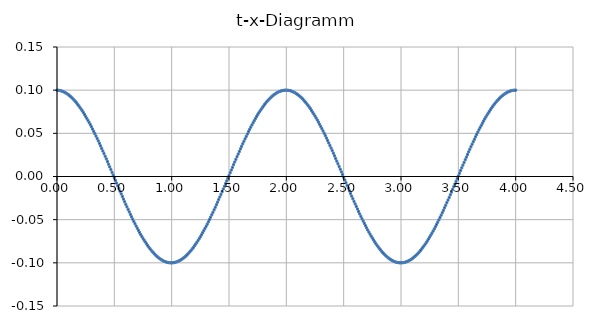
| Category | Series 0 |
|---|---|
| 0.0 | 0.1 |
| 0.01 | 0.1 |
| 0.02 | 0.1 |
| 0.03 | 0.099 |
| 0.04 | 0.099 |
| 0.05 | 0.099 |
| 0.06 | 0.098 |
| 0.07 | 0.097 |
| 0.08 | 0.096 |
| 0.09 | 0.096 |
| 0.1 | 0.095 |
| 0.11 | 0.094 |
| 0.12 | 0.092 |
| 0.13 | 0.091 |
| 0.14 | 0.09 |
| 0.15 | 0.088 |
| 0.16 | 0.087 |
| 0.17 | 0.085 |
| 0.18 | 0.084 |
| 0.19 | 0.082 |
| 0.2 | 0.08 |
| 0.21 | 0.078 |
| 0.22 | 0.076 |
| 0.23 | 0.074 |
| 0.24 | 0.072 |
| 0.25 | 0.07 |
| 0.26 | 0.067 |
| 0.27 | 0.065 |
| 0.28 | 0.063 |
| 0.29 | 0.06 |
| 0.3 | 0.058 |
| 0.31 | 0.055 |
| 0.32 | 0.052 |
| 0.33 | 0.05 |
| 0.34 | 0.047 |
| 0.35 | 0.044 |
| 0.36 | 0.041 |
| 0.37 | 0.038 |
| 0.38 | 0.035 |
| 0.39 | 0.032 |
| 0.4 | 0.03 |
| 0.41 | 0.026 |
| 0.42 | 0.023 |
| 0.43 | 0.02 |
| 0.44 | 0.017 |
| 0.45 | 0.014 |
| 0.46 | 0.011 |
| 0.47 | 0.008 |
| 0.48 | 0.005 |
| 0.49 | 0.002 |
| 0.5 | -0.001 |
| 0.51 | -0.005 |
| 0.52 | -0.008 |
| 0.53 | -0.011 |
| 0.54 | -0.014 |
| 0.55 | -0.017 |
| 0.56 | -0.02 |
| 0.57 | -0.023 |
| 0.58 | -0.026 |
| 0.59 | -0.029 |
| 0.6 | -0.032 |
| 0.61 | -0.035 |
| 0.62 | -0.038 |
| 0.63 | -0.041 |
| 0.64 | -0.044 |
| 0.65 | -0.047 |
| 0.66 | -0.049 |
| 0.67 | -0.052 |
| 0.68 | -0.055 |
| 0.69 | -0.057 |
| 0.7 | -0.06 |
| 0.71 | -0.062 |
| 0.72 | -0.065 |
| 0.73 | -0.067 |
| 0.74 | -0.069 |
| 0.75 | -0.072 |
| 0.76 | -0.074 |
| 0.77 | -0.076 |
| 0.78 | -0.078 |
| 0.790000000000001 | -0.08 |
| 0.8 | -0.082 |
| 0.810000000000001 | -0.083 |
| 0.82 | -0.085 |
| 0.83 | -0.087 |
| 0.84 | -0.088 |
| 0.850000000000001 | -0.09 |
| 0.860000000000001 | -0.091 |
| 0.87 | -0.092 |
| 0.88 | -0.093 |
| 0.890000000000001 | -0.095 |
| 0.900000000000001 | -0.096 |
| 0.910000000000001 | -0.096 |
| 0.92 | -0.097 |
| 0.930000000000001 | -0.098 |
| 0.940000000000001 | -0.098 |
| 0.950000000000001 | -0.099 |
| 0.960000000000001 | -0.099 |
| 0.970000000000001 | -0.1 |
| 0.980000000000001 | -0.1 |
| 0.990000000000001 | -0.1 |
| 1.0 | -0.1 |
| 1.01 | -0.1 |
| 1.02 | -0.1 |
| 1.03 | -0.099 |
| 1.04 | -0.099 |
| 1.05 | -0.099 |
| 1.06 | -0.098 |
| 1.07 | -0.097 |
| 1.08 | -0.097 |
| 1.09 | -0.096 |
| 1.1 | -0.095 |
| 1.11 | -0.094 |
| 1.12 | -0.093 |
| 1.13 | -0.091 |
| 1.14 | -0.09 |
| 1.15 | -0.089 |
| 1.16 | -0.087 |
| 1.17 | -0.085 |
| 1.18 | -0.084 |
| 1.19 | -0.082 |
| 1.2 | -0.08 |
| 1.21 | -0.078 |
| 1.22 | -0.076 |
| 1.23 | -0.074 |
| 1.24 | -0.072 |
| 1.25 | -0.07 |
| 1.26 | -0.068 |
| 1.27 | -0.065 |
| 1.28 | -0.063 |
| 1.29 | -0.06 |
| 1.3 | -0.058 |
| 1.31 | -0.055 |
| 1.32 | -0.053 |
| 1.33 | -0.05 |
| 1.34 | -0.047 |
| 1.35 | -0.044 |
| 1.36 | -0.041 |
| 1.37 | -0.039 |
| 1.38 | -0.036 |
| 1.39 | -0.033 |
| 1.4 | -0.03 |
| 1.41 | -0.027 |
| 1.42 | -0.024 |
| 1.43 | -0.021 |
| 1.44 | -0.018 |
| 1.45 | -0.014 |
| 1.46 | -0.011 |
| 1.47 | -0.008 |
| 1.48 | -0.005 |
| 1.49 | -0.002 |
| 1.5 | 0.001 |
| 1.51 | 0.004 |
| 1.52 | 0.007 |
| 1.53 | 0.011 |
| 1.54 | 0.014 |
| 1.55 | 0.017 |
| 1.56 | 0.02 |
| 1.57 | 0.023 |
| 1.58 | 0.026 |
| 1.59 | 0.029 |
| 1.6 | 0.032 |
| 1.61 | 0.035 |
| 1.62 | 0.038 |
| 1.63 | 0.041 |
| 1.64 | 0.044 |
| 1.65 | 0.046 |
| 1.66 | 0.049 |
| 1.67 | 0.052 |
| 1.68 | 0.055 |
| 1.69 | 0.057 |
| 1.7 | 0.06 |
| 1.71 | 0.062 |
| 1.72 | 0.065 |
| 1.73 | 0.067 |
| 1.74 | 0.069 |
| 1.75 | 0.071 |
| 1.76 | 0.074 |
| 1.77 | 0.076 |
| 1.78 | 0.078 |
| 1.79 | 0.08 |
| 1.8 | 0.082 |
| 1.81 | 0.083 |
| 1.82 | 0.085 |
| 1.83 | 0.087 |
| 1.84 | 0.088 |
| 1.85 | 0.09 |
| 1.86 | 0.091 |
| 1.87 | 0.092 |
| 1.88 | 0.093 |
| 1.89 | 0.094 |
| 1.9 | 0.095 |
| 1.91 | 0.096 |
| 1.92 | 0.097 |
| 1.93 | 0.098 |
| 1.94 | 0.098 |
| 1.95 | 0.099 |
| 1.96 | 0.099 |
| 1.97 | 0.1 |
| 1.98 | 0.1 |
| 1.99 | 0.1 |
| 2.0 | 0.1 |
| 2.01 | 0.1 |
| 2.02 | 0.1 |
| 2.03 | 0.099 |
| 2.04 | 0.099 |
| 2.05 | 0.099 |
| 2.06 | 0.098 |
| 2.07 | 0.097 |
| 2.08 | 0.097 |
| 2.09 | 0.096 |
| 2.1 | 0.095 |
| 2.11 | 0.094 |
| 2.12 | 0.093 |
| 2.13 | 0.091 |
| 2.14 | 0.09 |
| 2.15 | 0.089 |
| 2.16 | 0.087 |
| 2.17 | 0.086 |
| 2.18 | 0.084 |
| 2.19 | 0.082 |
| 2.2 | 0.08 |
| 2.21 | 0.078 |
| 2.22 | 0.076 |
| 2.23 | 0.074 |
| 2.24 | 0.072 |
| 2.25 | 0.07 |
| 2.26 | 0.068 |
| 2.27 | 0.065 |
| 2.28 | 0.063 |
| 2.29 | 0.061 |
| 2.29999999999999 | 0.058 |
| 2.30999999999999 | 0.055 |
| 2.31999999999999 | 0.053 |
| 2.32999999999999 | 0.05 |
| 2.33999999999999 | 0.047 |
| 2.34999999999999 | 0.045 |
| 2.35999999999999 | 0.042 |
| 2.36999999999999 | 0.039 |
| 2.37999999999999 | 0.036 |
| 2.38999999999999 | 0.033 |
| 2.39999999999999 | 0.03 |
| 2.40999999999999 | 0.027 |
| 2.41999999999999 | 0.024 |
| 2.42999999999999 | 0.021 |
| 2.43999999999999 | 0.018 |
| 2.44999999999999 | 0.015 |
| 2.45999999999999 | 0.012 |
| 2.46999999999999 | 0.008 |
| 2.47999999999999 | 0.005 |
| 2.48999999999999 | 0.002 |
| 2.49999999999999 | -0.001 |
| 2.50999999999999 | -0.004 |
| 2.51999999999999 | -0.007 |
| 2.52999999999999 | -0.01 |
| 2.53999999999999 | -0.013 |
| 2.54999999999999 | -0.017 |
| 2.55999999999999 | -0.02 |
| 2.56999999999999 | -0.023 |
| 2.57999999999999 | -0.026 |
| 2.58999999999999 | -0.029 |
| 2.59999999999999 | -0.032 |
| 2.60999999999999 | -0.035 |
| 2.61999999999999 | -0.038 |
| 2.62999999999999 | -0.041 |
| 2.63999999999999 | -0.043 |
| 2.64999999999999 | -0.046 |
| 2.65999999999999 | -0.049 |
| 2.66999999999999 | -0.052 |
| 2.67999999999999 | -0.054 |
| 2.68999999999999 | -0.057 |
| 2.69999999999999 | -0.059 |
| 2.70999999999999 | -0.062 |
| 2.71999999999999 | -0.064 |
| 2.72999999999999 | -0.067 |
| 2.73999999999999 | -0.069 |
| 2.74999999999999 | -0.071 |
| 2.75999999999999 | -0.073 |
| 2.76999999999998 | -0.076 |
| 2.77999999999998 | -0.078 |
| 2.78999999999998 | -0.08 |
| 2.79999999999998 | -0.081 |
| 2.80999999999998 | -0.083 |
| 2.81999999999998 | -0.085 |
| 2.82999999999998 | -0.087 |
| 2.83999999999998 | -0.088 |
| 2.84999999999998 | -0.089 |
| 2.85999999999998 | -0.091 |
| 2.86999999999998 | -0.092 |
| 2.87999999999998 | -0.093 |
| 2.88999999999998 | -0.094 |
| 2.89999999999998 | -0.095 |
| 2.90999999999998 | -0.096 |
| 2.91999999999998 | -0.097 |
| 2.92999999999998 | -0.098 |
| 2.93999999999998 | -0.098 |
| 2.94999999999998 | -0.099 |
| 2.95999999999998 | -0.099 |
| 2.96999999999998 | -0.1 |
| 2.97999999999998 | -0.1 |
| 2.98999999999998 | -0.1 |
| 2.99999999999998 | -0.1 |
| 3.00999999999998 | -0.1 |
| 3.01999999999998 | -0.1 |
| 3.02999999999998 | -0.099 |
| 3.03999999999998 | -0.099 |
| 3.04999999999998 | -0.099 |
| 3.05999999999998 | -0.098 |
| 3.06999999999998 | -0.097 |
| 3.07999999999998 | -0.097 |
| 3.08999999999998 | -0.096 |
| 3.09999999999998 | -0.095 |
| 3.10999999999998 | -0.094 |
| 3.11999999999998 | -0.093 |
| 3.12999999999998 | -0.091 |
| 3.13999999999998 | -0.09 |
| 3.14999999999998 | -0.089 |
| 3.15999999999998 | -0.087 |
| 3.16999999999998 | -0.086 |
| 3.17999999999998 | -0.084 |
| 3.18999999999998 | -0.082 |
| 3.19999999999998 | -0.08 |
| 3.20999999999998 | -0.079 |
| 3.21999999999998 | -0.077 |
| 3.22999999999997 | -0.075 |
| 3.23999999999997 | -0.072 |
| 3.24999999999997 | -0.07 |
| 3.25999999999997 | -0.068 |
| 3.26999999999997 | -0.066 |
| 3.27999999999997 | -0.063 |
| 3.28999999999997 | -0.061 |
| 3.29999999999997 | -0.058 |
| 3.30999999999997 | -0.056 |
| 3.31999999999997 | -0.053 |
| 3.32999999999997 | -0.05 |
| 3.33999999999997 | -0.048 |
| 3.34999999999997 | -0.045 |
| 3.35999999999997 | -0.042 |
| 3.36999999999997 | -0.039 |
| 3.37999999999997 | -0.036 |
| 3.38999999999997 | -0.033 |
| 3.39999999999997 | -0.03 |
| 3.40999999999997 | -0.027 |
| 3.41999999999997 | -0.024 |
| 3.42999999999997 | -0.021 |
| 3.43999999999997 | -0.018 |
| 3.44999999999997 | -0.015 |
| 3.45999999999997 | -0.012 |
| 3.46999999999997 | -0.009 |
| 3.47999999999997 | -0.006 |
| 3.48999999999997 | -0.002 |
| 3.49999999999997 | 0.001 |
| 3.50999999999997 | 0.004 |
| 3.51999999999997 | 0.007 |
| 3.52999999999997 | 0.01 |
| 3.53999999999997 | 0.013 |
| 3.54999999999997 | 0.016 |
| 3.55999999999997 | 0.019 |
| 3.56999999999997 | 0.022 |
| 3.57999999999997 | 0.025 |
| 3.58999999999997 | 0.028 |
| 3.59999999999997 | 0.031 |
| 3.60999999999997 | 0.034 |
| 3.61999999999997 | 0.037 |
| 3.62999999999997 | 0.04 |
| 3.63999999999997 | 0.043 |
| 3.64999999999997 | 0.046 |
| 3.65999999999997 | 0.049 |
| 3.66999999999997 | 0.051 |
| 3.67999999999997 | 0.054 |
| 3.68999999999997 | 0.057 |
| 3.69999999999996 | 0.059 |
| 3.70999999999996 | 0.062 |
| 3.71999999999996 | 0.064 |
| 3.72999999999996 | 0.067 |
| 3.73999999999996 | 0.069 |
| 3.74999999999996 | 0.071 |
| 3.75999999999996 | 0.073 |
| 3.76999999999996 | 0.075 |
| 3.77999999999996 | 0.077 |
| 3.78999999999996 | 0.079 |
| 3.79999999999996 | 0.081 |
| 3.80999999999996 | 0.083 |
| 3.81999999999996 | 0.085 |
| 3.82999999999996 | 0.086 |
| 3.83999999999996 | 0.088 |
| 3.84999999999996 | 0.089 |
| 3.85999999999996 | 0.091 |
| 3.86999999999996 | 0.092 |
| 3.87999999999996 | 0.093 |
| 3.88999999999996 | 0.094 |
| 3.89999999999996 | 0.095 |
| 3.90999999999996 | 0.096 |
| 3.91999999999996 | 0.097 |
| 3.92999999999996 | 0.098 |
| 3.93999999999996 | 0.098 |
| 3.94999999999996 | 0.099 |
| 3.95999999999996 | 0.099 |
| 3.96999999999996 | 0.1 |
| 3.97999999999996 | 0.1 |
| 3.98999999999996 | 0.1 |
| 3.99999999999996 | 0.1 |